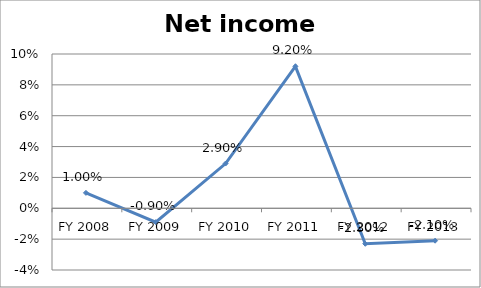
| Category | Net income ratio |
|---|---|
| FY 2013 | -0.021 |
| FY 2012 | -0.023 |
| FY 2011 | 0.092 |
| FY 2010 | 0.029 |
| FY 2009 | -0.009 |
| FY 2008 | 0.01 |